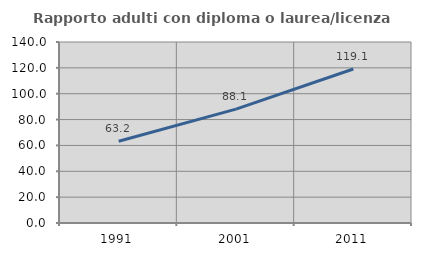
| Category | Rapporto adulti con diploma o laurea/licenza media  |
|---|---|
| 1991.0 | 63.227 |
| 2001.0 | 88.058 |
| 2011.0 | 119.122 |